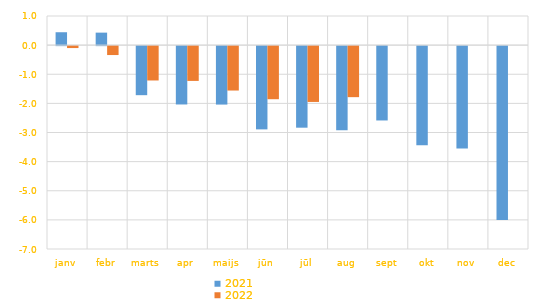
| Category | 2021 | 2022 |
|---|---|---|
| janv | 0.443 | -0.066 |
| febr | 0.429 | -0.306 |
| marts | -1.684 | -1.18 |
| apr | -2.003 | -1.195 |
| maijs | -2.007 | -1.525 |
| jūn | -2.858 | -1.823 |
| jūl | -2.8 | -1.917 |
| aug | -2.892 | -1.752 |
| sept | -2.553 | 0 |
| okt | -3.401 | 0 |
| nov | -3.514 | 0 |
| dec | -5.966 | 0 |